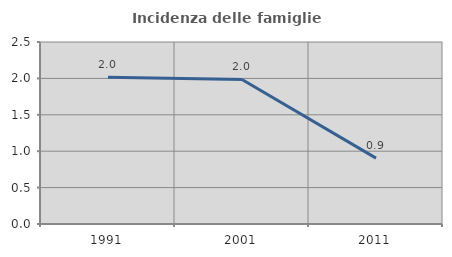
| Category | Incidenza delle famiglie numerose |
|---|---|
| 1991.0 | 2.016 |
| 2001.0 | 1.986 |
| 2011.0 | 0.905 |